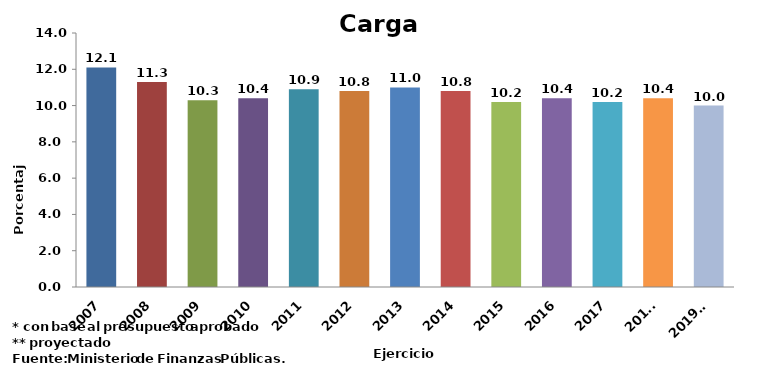
| Category | Series 0 |
|---|---|
| 2007 | 12.1 |
| 2008 | 11.3 |
| 2009 | 10.3 |
| 2010 | 10.4 |
| 2011 | 10.9 |
| 2012 | 10.8 |
| 2013 | 11 |
| 2014 | 10.8 |
| 2015 | 10.2 |
| 2016 | 10.4 |
| 2017 | 10.2 |
| 2018* | 10.4 |
| 2019** | 10 |